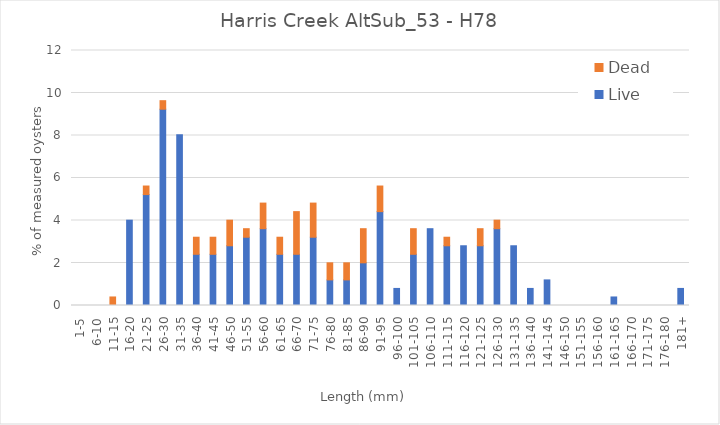
| Category | Live | Dead |
|---|---|---|
| 1-5 | 0 | 0 |
| 6-10 | 0 | 0 |
| 11-15 | 0 | 0.402 |
| 16-20 | 4.016 | 0 |
| 21-25 | 5.221 | 0.402 |
| 26-30 | 9.237 | 0.402 |
| 31-35 | 8.032 | 0 |
| 36-40 | 2.41 | 0.803 |
| 41-45 | 2.41 | 0.803 |
| 46-50 | 2.811 | 1.205 |
| 51-55 | 3.213 | 0.402 |
| 56-60 | 3.614 | 1.205 |
| 61-65 | 2.41 | 0.803 |
| 66-70 | 2.41 | 2.008 |
| 71-75 | 3.213 | 1.606 |
| 76-80 | 1.205 | 0.803 |
| 81-85 | 1.205 | 0.803 |
| 86-90 | 2.008 | 1.606 |
| 91-95 | 4.418 | 1.205 |
| 96-100 | 0.803 | 0 |
| 101-105 | 2.41 | 1.205 |
| 106-110 | 3.614 | 0 |
| 111-115 | 2.811 | 0.402 |
| 116-120 | 2.811 | 0 |
| 121-125 | 2.811 | 0.803 |
| 126-130 | 3.614 | 0.402 |
| 131-135 | 2.811 | 0 |
| 136-140 | 0.803 | 0 |
| 141-145 | 1.205 | 0 |
| 146-150 | 0 | 0 |
| 151-155 | 0 | 0 |
| 156-160 | 0 | 0 |
| 161-165 | 0.402 | 0 |
| 166-170 | 0 | 0 |
| 171-175 | 0 | 0 |
| 176-180 | 0 | 0 |
| 181+ | 0.803 | 0 |